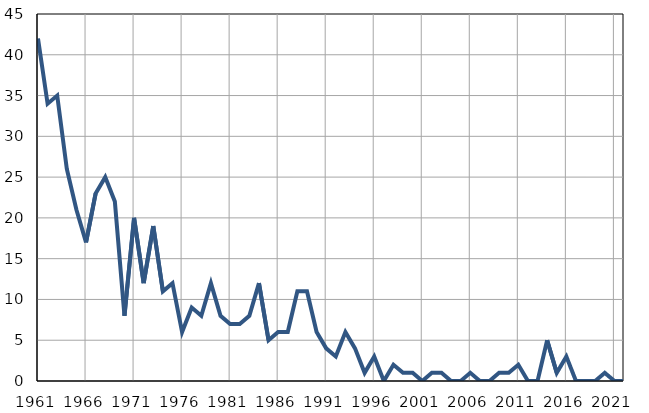
| Category | Infants
deaths |
|---|---|
| 1961.0 | 42 |
| 1962.0 | 34 |
| 1963.0 | 35 |
| 1964.0 | 26 |
| 1965.0 | 21 |
| 1966.0 | 17 |
| 1967.0 | 23 |
| 1968.0 | 25 |
| 1969.0 | 22 |
| 1970.0 | 8 |
| 1971.0 | 20 |
| 1972.0 | 12 |
| 1973.0 | 19 |
| 1974.0 | 11 |
| 1975.0 | 12 |
| 1976.0 | 6 |
| 1977.0 | 9 |
| 1978.0 | 8 |
| 1979.0 | 12 |
| 1980.0 | 8 |
| 1981.0 | 7 |
| 1982.0 | 7 |
| 1983.0 | 8 |
| 1984.0 | 12 |
| 1985.0 | 5 |
| 1986.0 | 6 |
| 1987.0 | 6 |
| 1988.0 | 11 |
| 1989.0 | 11 |
| 1990.0 | 6 |
| 1991.0 | 4 |
| 1992.0 | 3 |
| 1993.0 | 6 |
| 1994.0 | 4 |
| 1995.0 | 1 |
| 1996.0 | 3 |
| 1997.0 | 0 |
| 1998.0 | 2 |
| 1999.0 | 1 |
| 2000.0 | 1 |
| 2001.0 | 0 |
| 2002.0 | 1 |
| 2003.0 | 1 |
| 2004.0 | 0 |
| 2005.0 | 0 |
| 2006.0 | 1 |
| 2007.0 | 0 |
| 2008.0 | 0 |
| 2009.0 | 1 |
| 2010.0 | 1 |
| 2011.0 | 2 |
| 2012.0 | 0 |
| 2013.0 | 0 |
| 2014.0 | 5 |
| 2015.0 | 1 |
| 2016.0 | 3 |
| 2017.0 | 0 |
| 2018.0 | 0 |
| 2019.0 | 0 |
| 2020.0 | 1 |
| 2021.0 | 0 |
| 2022.0 | 0 |